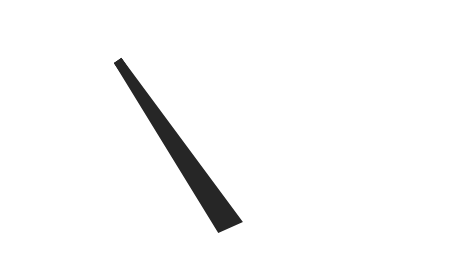
| Category | y |
|---|---|
| 25.813334700457727 | 43.761 |
| 51.75043090543462 | 0.967 |
| 48.24956909456538 | -0.967 |
| 25.813334700457727 | 43.761 |
| 50.0 | 0 |